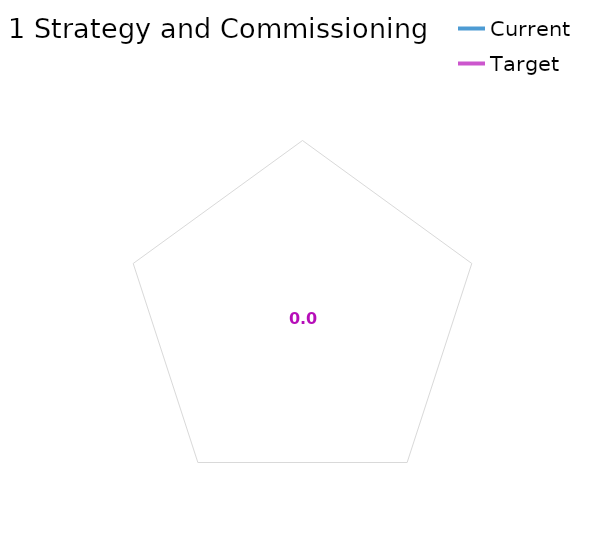
| Category | Current | Target |
|---|---|---|
| 1 Strategy and Commissioning average | 0 | 0 |
| 1.1 Well-developed strategy or approach | 0 | 0 |
| 1.2 Strong internal case for change | 0 | 0 |
| 1.3 Clear approach to benefits realisation | 0 | 0 |
| 1.4 Well integrated into wider programmes | 0 | 0 |